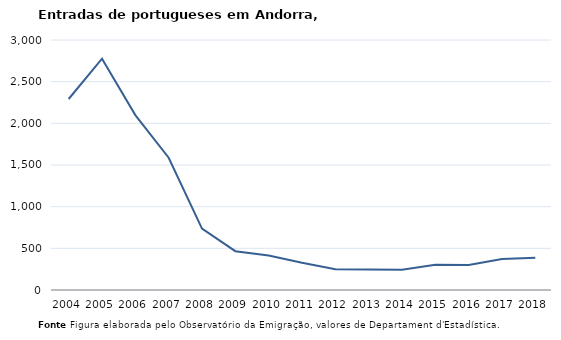
| Category | Entradas |
|---|---|
| 2004.0 | 2292 |
| 2005.0 | 2776 |
| 2006.0 | 2099 |
| 2007.0 | 1587 |
| 2008.0 | 736 |
| 2009.0 | 466 |
| 2010.0 | 415 |
| 2011.0 | 327 |
| 2012.0 | 250 |
| 2013.0 | 246 |
| 2014.0 | 244 |
| 2015.0 | 303 |
| 2016.0 | 301 |
| 2017.0 | 372 |
| 2018.0 | 386 |